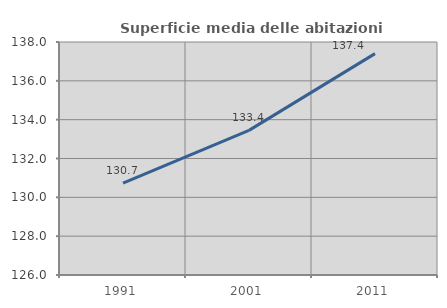
| Category | Superficie media delle abitazioni occupate |
|---|---|
| 1991.0 | 130.73 |
| 2001.0 | 133.45 |
| 2011.0 | 137.401 |